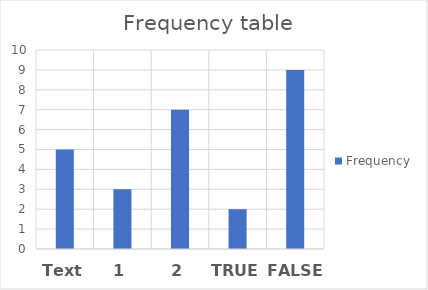
| Category | Frequency |
|---|---|
| Text | 5 |
| 1 | 3 |
| 2 | 7 |
| TRUE | 2 |
| FALSE | 9 |